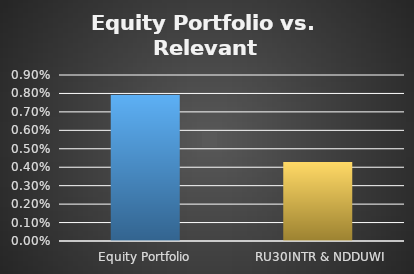
| Category | Series 0 |
|---|---|
| Equity Portfolio | 0.008 |
|   RU30INTR & NDDUWI | 0.004 |